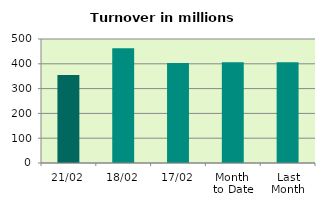
| Category | Series 0 |
|---|---|
| 21/02 | 354.555 |
| 18/02 | 463.191 |
| 17/02 | 403.618 |
| Month 
to Date | 405.871 |
| Last
Month | 406.741 |